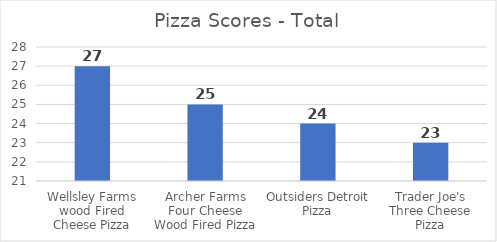
| Category | Series 0 |
|---|---|
| Wellsley Farms wood Fired Cheese Pizza | 27 |
| Archer Farms Four Cheese Wood Fired Pizza | 25 |
| Outsiders Detroit Pizza | 24 |
| Trader Joe's Three Cheese Pizza | 23 |